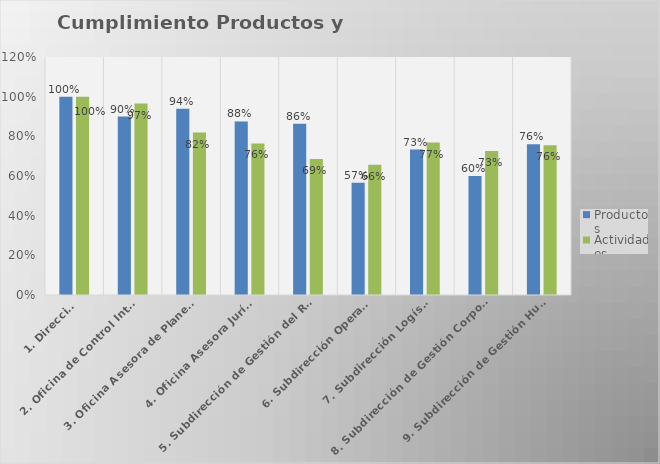
| Category | Productos | Actividades |
|---|---|---|
| 1. Dirección | 1 | 1 |
| 2. Oficina de Control Interno | 0.9 | 0.965 |
| 3. Oficina Asesora de Planeación | 0.939 | 0.819 |
| 4. Oficina Asesora Jurídica | 0.875 | 0.764 |
| 5. Subdirección de Gestión del Riesgo | 0.863 | 0.686 |
| 6. Subdirección Operativa | 0.566 | 0.656 |
| 7. Subdirección Logística | 0.733 | 0.769 |
| 8. Subdirección de Gestión Corporativa | 0.6 | 0.726 |
| 9. Subdirección de Gestión Humana | 0.76 | 0.756 |